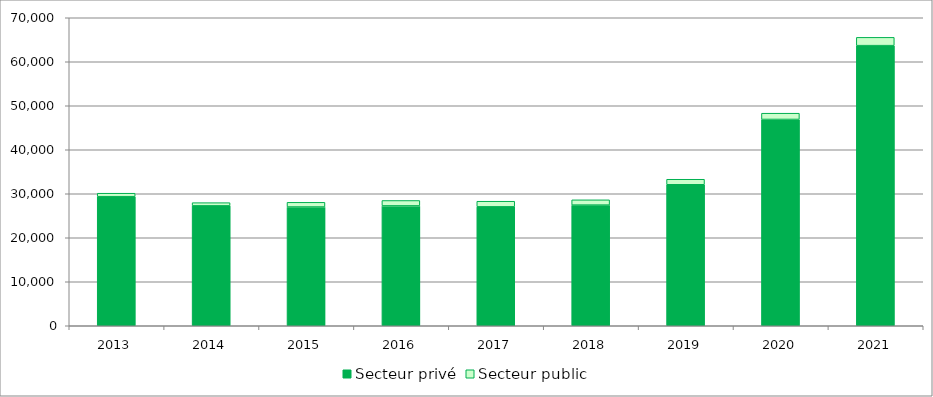
| Category | Secteur privé | Secteur public |
|---|---|---|
| 2013.0 | 29329 | 793 |
| 2014.0 | 27245 | 731 |
| 2015.0 | 26987 | 1067 |
| 2016.0 | 27238 | 1235 |
| 2017.0 | 27027 | 1273 |
| 2018.0 | 27416 | 1203 |
| 2019.0 | 32045 | 1253 |
| 2020.0 | 46884 | 1423 |
| 2021.0 | 63660 | 1887 |